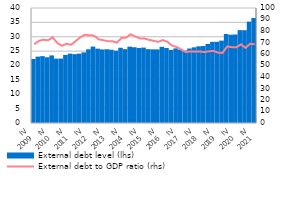
| Category | External debt level (lhs) |
|---|---|
| IV
2009 | 22.272 |
| I | 23.09 |
| II | 23.254 |
| III | 22.861 |
| IV
2010 | 23.509 |
| I | 22.384 |
| II | 22.4 |
| III | 23.676 |
| IV
2011 | 24.123 |
| I | 23.947 |
| II | 24.124 |
| III | 24.565 |
| IV
2012 | 25.645 |
| I | 26.582 |
| II | 25.858 |
| III | 25.582 |
| IV
2013 | 25.644 |
| I | 25.497 |
| II | 25.144 |
| III | 26.171 |
| IV
2014 | 25.679 |
| I | 26.552 |
| II | 26.348 |
| III | 26.111 |
| IV
2015 | 26.234 |
| I | 25.682 |
| II | 25.621 |
| III | 25.603 |
| IV
2016 | 26.494 |
| I | 26.088 |
| II | 25.385 |
| III | 25.946 |
| IV
2017 | 25.526 |
| I | 25.216 |
| II | 25.906 |
| III | 26.312 |
| IV
2018 | 26.662 |
| I | 26.764 |
| II | 27.476 |
| III | 28.227 |
| IV
2019 | 28.254 |
| I | 28.655 |
| II | 30.959 |
| III | 30.719 |
| IV
2020 | 30.787 |
| I | 32.303 |
| II | 32.272 |
| III | 35.258 |
| IV
2021 | 36.536 |